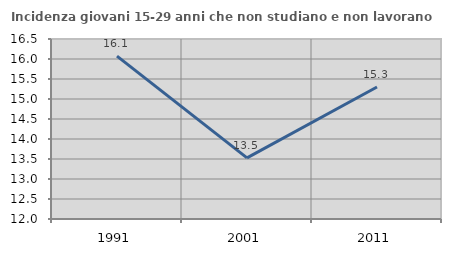
| Category | Incidenza giovani 15-29 anni che non studiano e non lavorano  |
|---|---|
| 1991.0 | 16.073 |
| 2001.0 | 13.527 |
| 2011.0 | 15.301 |